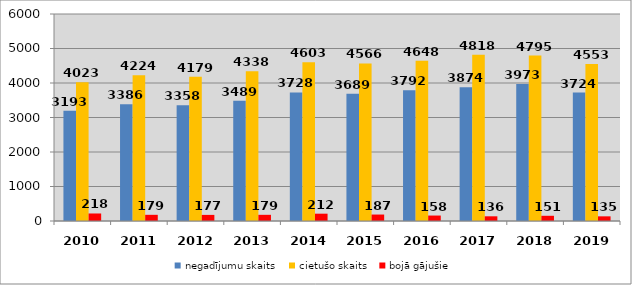
| Category | negadījumu skaits | cietušo skaits | bojā gājušie |
|---|---|---|---|
| 2010.0 | 3193 | 4023 | 218 |
| 2011.0 | 3386 | 4224 | 179 |
| 2012.0 | 3358 | 4179 | 177 |
| 2013.0 | 3489 | 4338 | 179 |
| 2014.0 | 3728 | 4603 | 212 |
| 2015.0 | 3689 | 4566 | 187 |
| 2016.0 | 3792 | 4648 | 158 |
| 2017.0 | 3874 | 4818 | 136 |
| 2018.0 | 3973 | 4795 | 151 |
| 2019.0 | 3724 | 4553 | 135 |